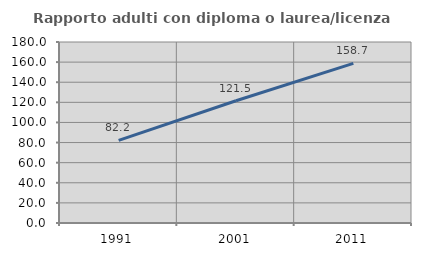
| Category | Rapporto adulti con diploma o laurea/licenza media  |
|---|---|
| 1991.0 | 82.158 |
| 2001.0 | 121.532 |
| 2011.0 | 158.682 |